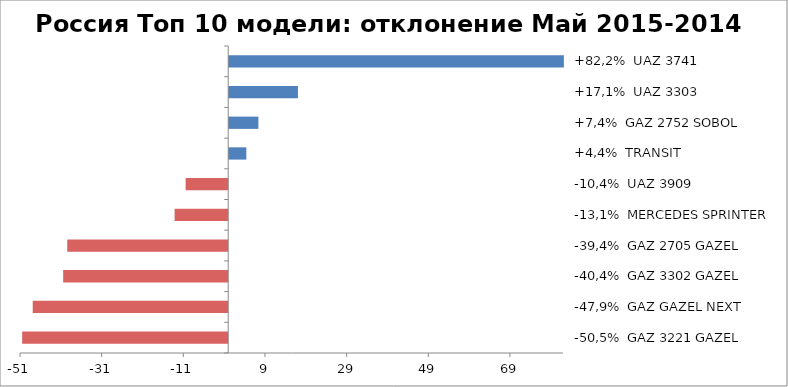
| Category | Россия Топ 10 модели: отклонение Май 2015-2014 |
|---|---|
| -50,5%  GAZ 3221 GAZEL | -50.467 |
| -47,9%  GAZ GAZEL NEXT | -47.882 |
| -40,4%  GAZ 3302 GAZEL | -40.423 |
| -39,4%  GAZ 2705 GAZEL | -39.426 |
| -13,1%  MERCEDES SPRINTER | -13.128 |
| -10,4%  UAZ 3909 | -10.429 |
| +4,4%  TRANSIT | 4.44 |
| +7,4%  GAZ 2752 SOBOL | 7.389 |
| +17,1%  UAZ 3303 | 17.073 |
| +82,2%  UAZ 3741 | 82.219 |